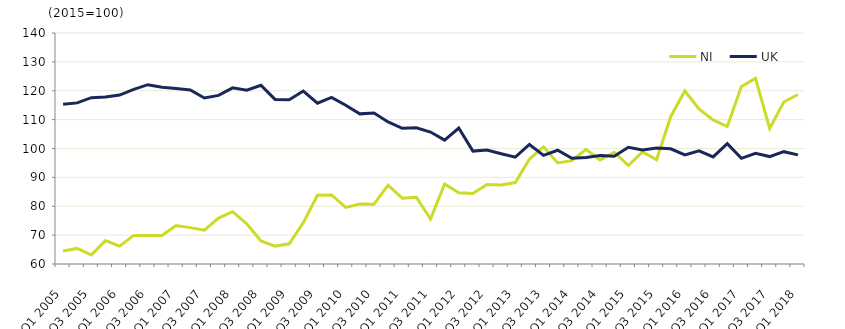
| Category | NI  | UK  |
|---|---|---|
| Q1 2005 | 64.5 | 115.3 |
|  | 65.4 | 115.8 |
| Q3 2005 | 63.1 | 117.6 |
|  | 68.1 | 117.8 |
| Q1 2006 | 66.2 | 118.5 |
|  | 69.9 | 120.5 |
| Q3 2006 | 69.9 | 122.1 |
|  | 69.9 | 121.2 |
| Q1 2007 | 73.3 | 120.8 |
|  | 72.6 | 120.3 |
| Q3 2007 | 71.7 | 117.5 |
|  | 75.9 | 118.4 |
| Q1 2008 | 78.1 | 121 |
|  | 73.9 | 120.2 |
| Q3 2008 | 68 | 121.9 |
|  | 66.2 | 117 |
| Q1 2009 | 67 | 116.9 |
|  | 74.3 | 119.9 |
| Q3 2009 | 83.8 | 115.7 |
|  | 83.9 | 117.7 |
| Q1 2010 | 79.6 | 115 |
|  | 80.8 | 112 |
| Q3 2010 | 80.7 | 112.3 |
|  | 87.3 | 109.2 |
| Q1 2011 | 82.8 | 107 |
|  | 83.1 | 107.2 |
| Q3 2011 | 75.6 | 105.7 |
|  | 87.7 | 102.9 |
| Q1 2012 | 84.7 | 107.1 |
|  | 84.4 | 99.1 |
| Q3 2012 | 87.5 | 99.5 |
|  | 87.4 | 98.2 |
| Q1 2013 | 88.2 | 97 |
|  | 96.3 | 101.4 |
| Q3 2013 | 100.6 | 97.6 |
|  | 95 | 99.4 |
| Q1 2014 | 95.8 | 96.6 |
|  | 99.7 | 96.9 |
| Q3 2014 | 96 | 97.6 |
|  | 98.7 | 97.3 |
| Q1 2015 | 94.1 | 100.4 |
|  | 98.8 | 99.5 |
| Q3 2015 | 96.1 | 100.2 |
|  | 111.1 | 99.9 |
| Q1 2016 | 119.9 | 97.8 |
|  | 113.7 | 99.2 |
| Q3 2016 | 109.9 | 97.1 |
|  | 107.6 | 101.7 |
| Q1 2017 | 121.5 | 96.6 |
|  | 124.3 | 98.3 |
| Q3 2017 | 106.9 | 97.2 |
|  | 116.1 | 98.9 |
| Q1 2018 | 118.7 | 97.8 |